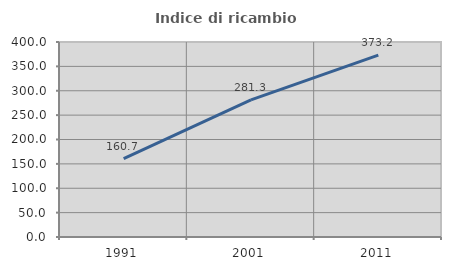
| Category | Indice di ricambio occupazionale  |
|---|---|
| 1991.0 | 160.714 |
| 2001.0 | 281.319 |
| 2011.0 | 373.171 |